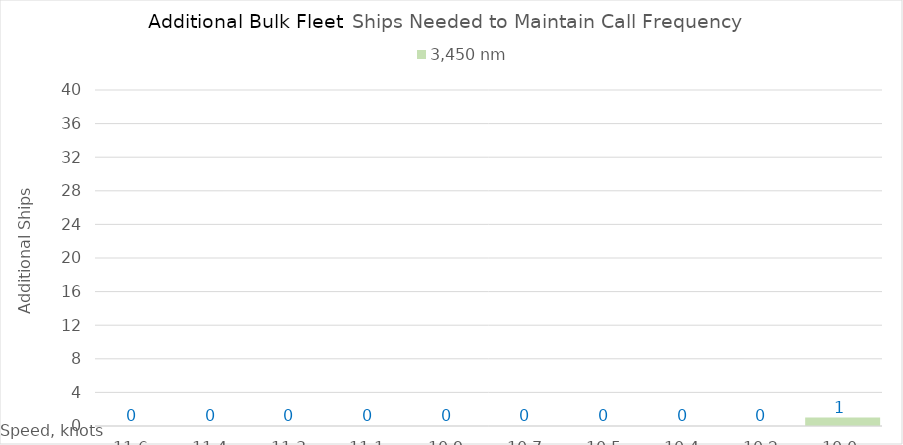
| Category | 3,450 |
|---|---|
| 11.620000000000001 | 0 |
| 11.440000000000001 | 0 |
| 11.260000000000002 | 0 |
| 11.080000000000002 | 0 |
| 10.900000000000002 | 0 |
| 10.720000000000002 | 0 |
| 10.540000000000003 | 0 |
| 10.360000000000003 | 0 |
| 10.180000000000003 | 0 |
| 10.000000000000004 | 1 |